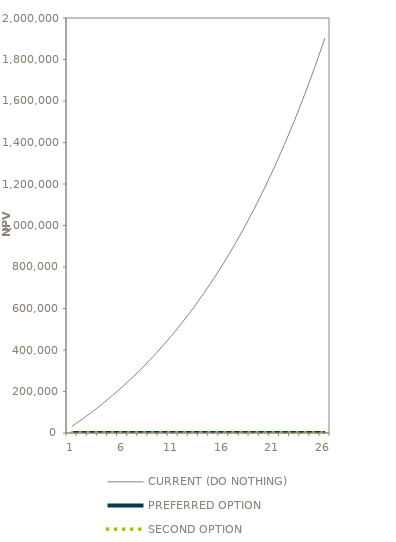
| Category | CURRENT (DO NOTHING) | PREFERRED OPTION | SECOND OPTION |
|---|---|---|---|
| 1.0 | 32276.78 | 0 | 0 |
| 2.0 | 66378.08 | 0 | 0 |
| 3.0 | 102427.408 | 0 | 0 |
| 4.0 | 140555.633 | 0 | 0 |
| 5.0 | 180901.467 | 0 | 0 |
| 6.0 | 223611.975 | 0 | 0 |
| 7.0 | 268843.114 | 0 | 0 |
| 8.0 | 316760.308 | 0 | 0 |
| 9.0 | 367539.055 | 0 | 0 |
| 10.0 | 421365.576 | 0 | 0 |
| 11.0 | 478437.498 | 0 | 0 |
| 12.0 | 538964.588 | 0 | 0 |
| 13.0 | 603169.522 | 0 | 0 |
| 14.0 | 671288.712 | 0 | 0 |
| 15.0 | 743573.178 | 0 | 0 |
| 16.0 | 820289.473 | 0 | 0 |
| 17.0 | 901720.673 | 0 | 0 |
| 18.0 | 988167.423 | 0 | 0 |
| 19.0 | 1079949.048 | 0 | 0 |
| 20.0 | 1177404.736 | 0 | 0 |
| 21.0 | 1280894.795 | 0 | 0 |
| 22.0 | 1390801.985 | 0 | 0 |
| 23.0 | 1507532.938 | 0 | 0 |
| 24.0 | 1631519.664 | 0 | 0 |
| 25.0 | 1763221.15 | 0 | 0 |
| 26.0 | 1903125.064 | 0 | 0 |